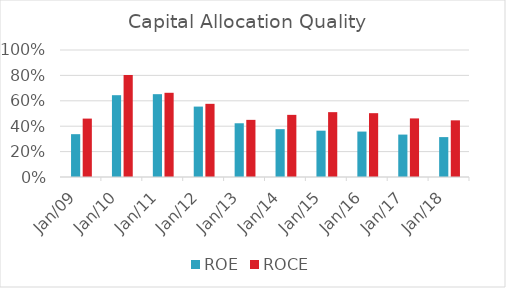
| Category | ROE | ROCE |
|---|---|---|
| Mar-09 | 0.337 | 0.46 |
| Mar-10 | 0.644 | 0.803 |
| Mar-11 | 0.652 | 0.663 |
| Mar-12 | 0.554 | 0.576 |
| Mar-13 | 0.423 | 0.45 |
| Mar-14 | 0.377 | 0.489 |
| Mar-15 | 0.365 | 0.511 |
| Mar-16 | 0.358 | 0.503 |
| Mar-17 | 0.334 | 0.461 |
| Mar-18 | 0.314 | 0.446 |